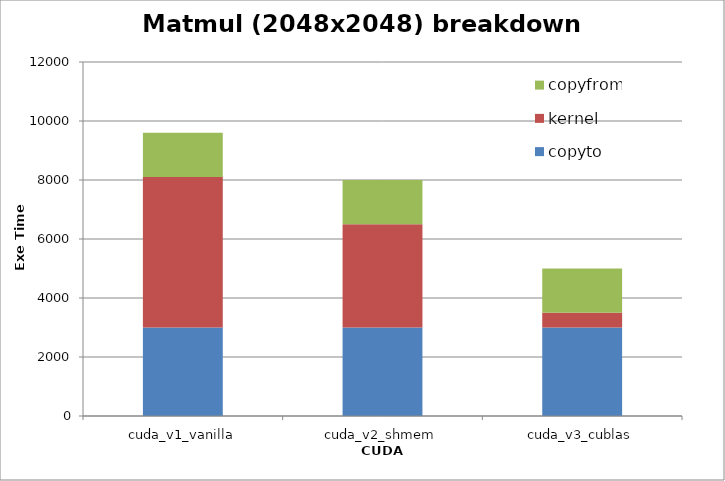
| Category | copyto | kernel | copyfrom |
|---|---|---|---|
| cuda_v1_vanilla | 3000 | 5100 | 1500 |
| cuda_v2_shmem | 3000 | 3500 | 1500 |
| cuda_v3_cublas | 3000 | 500 | 1500 |